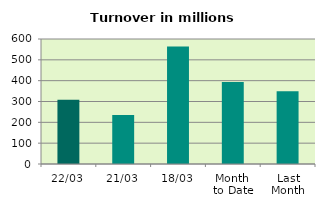
| Category | Series 0 |
|---|---|
| 22/03 | 308.748 |
| 21/03 | 235.502 |
| 18/03 | 564.159 |
| Month 
to Date | 393.727 |
| Last
Month | 349.641 |